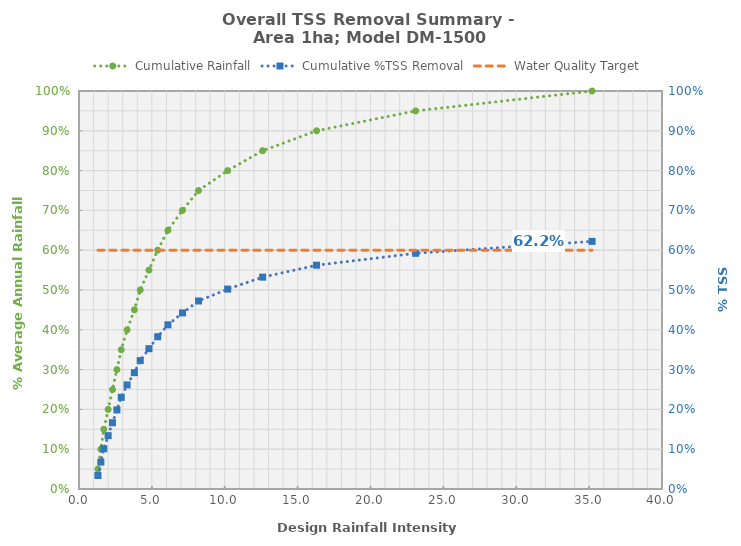
| Category | Cumulative Rainfall |
|---|---|
| 1.3 | 0.05 |
| 1.5 | 0.1 |
| 1.7 | 0.15 |
| 2.0 | 0.2 |
| 2.3 | 0.25 |
| 2.6 | 0.3 |
| 2.9 | 0.35 |
| 3.3 | 0.4 |
| 3.8 | 0.45 |
| 4.2 | 0.5 |
| 4.8 | 0.55 |
| 5.4 | 0.6 |
| 6.1 | 0.65 |
| 7.1 | 0.7 |
| 8.2 | 0.75 |
| 10.2 | 0.8 |
| 12.6 | 0.85 |
| 16.3 | 0.9 |
| 23.1 | 0.95 |
| 35.2 | 1 |